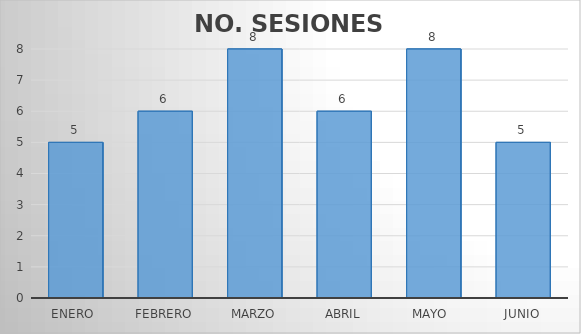
| Category | NO. SESIONES EFECTUADAS |
|---|---|
| Enero  | 5 |
| Febrero | 6 |
| Marzo | 8 |
| Abril | 6 |
| Mayo  | 8 |
| Junio | 5 |